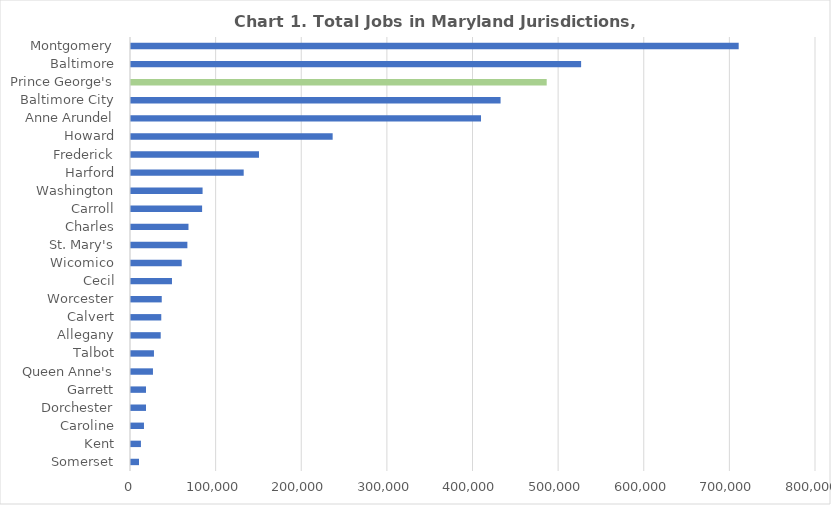
| Category | Series 0 |
|---|---|
| Somerset | 9359 |
| Kent | 11599 |
| Caroline | 15150 |
| Dorchester | 17542 |
| Garrett | 17545 |
| Queen Anne's | 25652 |
| Talbot | 26812 |
| Allegany | 34707 |
| Calvert | 35353 |
| Worcester | 35906 |
| Cecil | 47856 |
| Wicomico | 59226 |
| St. Mary's | 65835 |
| Charles | 67133 |
| Carroll | 83044 |
| Washington | 83595 |
| Harford | 131618 |
| Frederick | 149477 |
| Howard | 235511 |
| Anne Arundel | 408769 |
| Baltimore City | 431628 |
| Prince George's | 485497 |
| Baltimore | 525685 |
| Montgomery | 709712 |